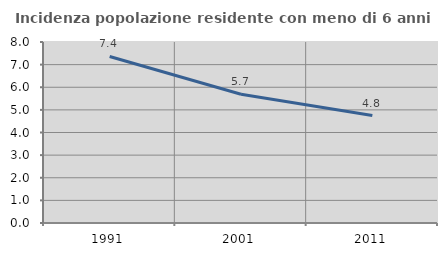
| Category | Incidenza popolazione residente con meno di 6 anni |
|---|---|
| 1991.0 | 7.36 |
| 2001.0 | 5.691 |
| 2011.0 | 4.75 |